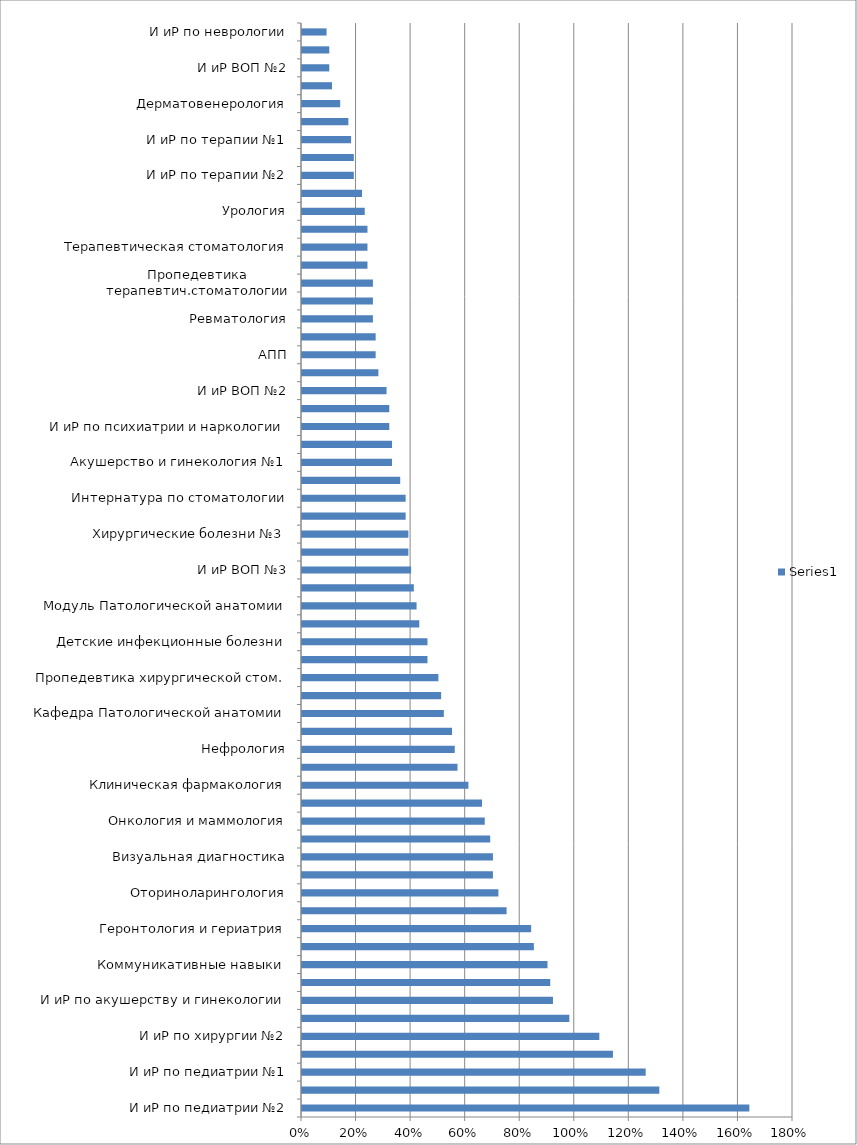
| Category | Series 0 |
|---|---|
| И иР по педиатрии №2 | 1.64 |
| Детские болезни №1 | 1.31 |
| И иР по педиатрии №1 | 1.26 |
| И иР по терапии №3 | 1.14 |
| И иР по хирургии №2 | 1.09 |
| СНМП | 0.98 |
| И иР по акушерству и гинекологии | 0.92 |
| ЛДиММ | 0.91 |
| Коммуникативные навыки  | 0.9 |
| Инфекционные и тропические болезни | 0.85 |
| Геронтология и гериатрия | 0.84 |
| Вич-инфекция и ИК | 0.75 |
| Оториноларингология | 0.72 |
| Акушерство и гинекология №2 | 0.7 |
| Визуальная диагностика | 0.7 |
| Нервные болезни | 0.69 |
| Онкология и маммология | 0.67 |
| Неонатология | 0.66 |
| Клиническая фармакология | 0.61 |
| Стом. Детского возраста | 0.57 |
| Нефрология | 0.56 |
| Психиатрия и наркология | 0.55 |
| Кафедра Патологической анатомии | 0.52 |
| Аллергология | 0.51 |
| Пропедевтика хирургической стом. | 0.5 |
| АПТ | 0.46 |
| Детские инфекционные болезни | 0.46 |
| Травматология | 0.43 |
| Модуль Патологической анатомии | 0.42 |
| Десткая хирургия  | 0.41 |
| И иР ВОП №3 | 0.4 |
| Введение в клинику | 0.39 |
| Хирургические болезни №3 | 0.39 |
| Эндокринология | 0.38 |
| Интернатура по стоматологии | 0.38 |
| Нейрохирургия | 0.36 |
| Акушерство и гинекология №1 | 0.33 |
| Офтальмология | 0.33 |
| И иР по психиатрии и наркологии | 0.32 |
| Пропедевтика ортопед.стоматологии  | 0.32 |
| И иР ВОП №2 | 0.31 |
| Ортопедическая стоматология | 0.28 |
| АПП | 0.27 |
| Пропедевтика стом. Десткого возраста  | 0.27 |
| Ревматология | 0.26 |
| Внутренние болезни №1 | 0.26 |
| Пропедевтика терапевтич.стоматологии | 0.26 |
| Внутренние болезни №4 | 0.24 |
| Терапевтическая стоматология | 0.24 |
| Хирургическая стоматология  | 0.24 |
| Урология | 0.23 |
| Анестезиология и реаниматология | 0.22 |
| И иР по терапии №2 | 0.19 |
| Хирургические болезни №1 | 0.19 |
| И иР по терапии №1 | 0.18 |
| Клиническая анатомия и опер. Хирургия | 0.17 |
| Дерматовенерология | 0.14 |
| Фтизиопульмонология | 0.11 |
| И иР ВОП №2 | 0.1 |
| И иР по хирургии №1 | 0.1 |
| И иР по неврологии | 0.09 |